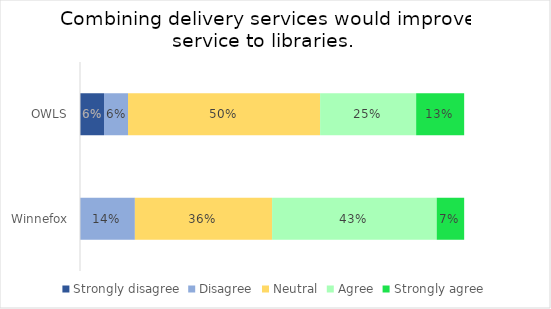
| Category | Strongly disagree | Disagree | Neutral | Agree | Strongly agree |
|---|---|---|---|---|---|
| OWLS | 0.062 | 0.062 | 0.5 | 0.25 | 0.125 |
| Winnefox | 0 | 0.143 | 0.357 | 0.429 | 0.071 |